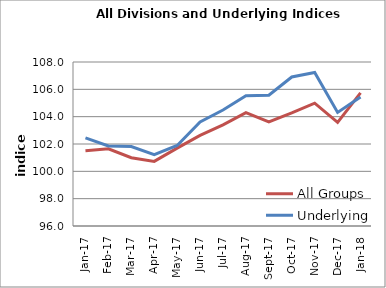
| Category | All Groups | Underlying |
|---|---|---|
| 2017-01-01 | 101.51 | 102.449 |
| 2017-02-01 | 101.644 | 101.858 |
| 2017-03-01 | 100.999 | 101.809 |
| 2017-04-01 | 100.727 | 101.214 |
| 2017-05-01 | 101.699 | 101.894 |
| 2017-06-01 | 102.633 | 103.613 |
| 2017-07-01 | 103.397 | 104.483 |
| 2017-08-01 | 104.291 | 105.536 |
| 2017-09-01 | 103.612 | 105.565 |
| 2017-10-01 | 104.27 | 106.905 |
| 2017-11-01 | 104.991 | 107.237 |
| 2017-12-01 | 103.588 | 104.31 |
| 2018-01-01 | 105.739 | 105.443 |